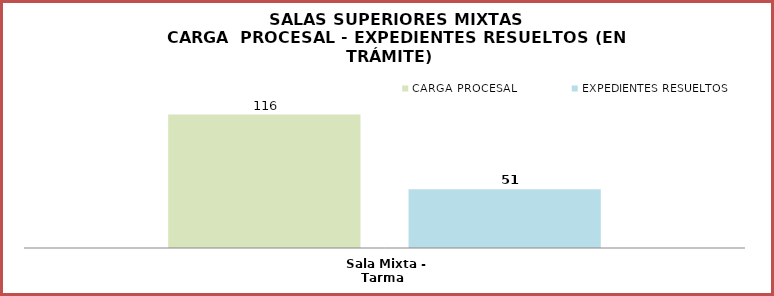
| Category | CARGA PROCESAL | EXPEDIENTES RESUELTOS |
|---|---|---|
| Sala Mixta - Tarma | 116 | 51 |